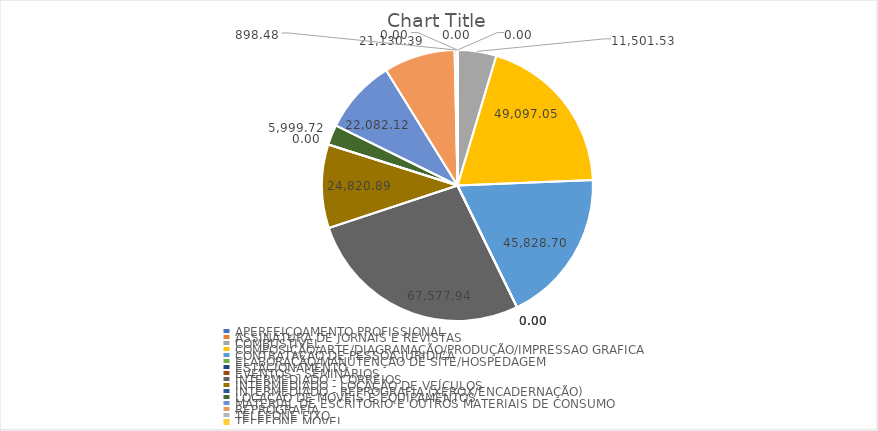
| Category | Series 0 |
|---|---|
| APERFEIÇOAMENTO PROFISSIONAL | 0 |
| ASSINATURA DE JORNAIS E REVISTAS | 0 |
| COMBUSTIVEL | 11501.533 |
| COMPOSIÇÃO/ARTE/DIAGRAMAÇÃO/PRODUÇÃO/IMPRESSAO GRAFICA | 49097.047 |
| CONTRATAÇAO DE PESSOA JURIDICA | 45828.697 |
| ELABORAÇÃO/MANUTENÇAO DE SITE/HOSPEDAGEM | 0 |
| ESTACIONAMENTO | 0 |
| EVENTOS - SEMINÁRIOS | 0 |
| INTERMEDIADO - CORREIOS | 67577.937 |
| INTERMEDIADO - LOCAÇÃO DE VEÍCULOS | 24820.893 |
| INTERMEDIADO - REPROGRAFIA (XEROX/ENCADERNAÇÃO) | 0 |
| LOCAÇÃO DE MOVEIS E EQUIPAMENTOS | 5999.717 |
| MATERIAL DE ESCRITORIO E OUTROS MATERIAIS DE CONSUMO | 22082.123 |
| REPROGRAFIA | 21130.393 |
| TELEFONE FIXO | 898.477 |
| TELEFONE MOVEL | 0 |